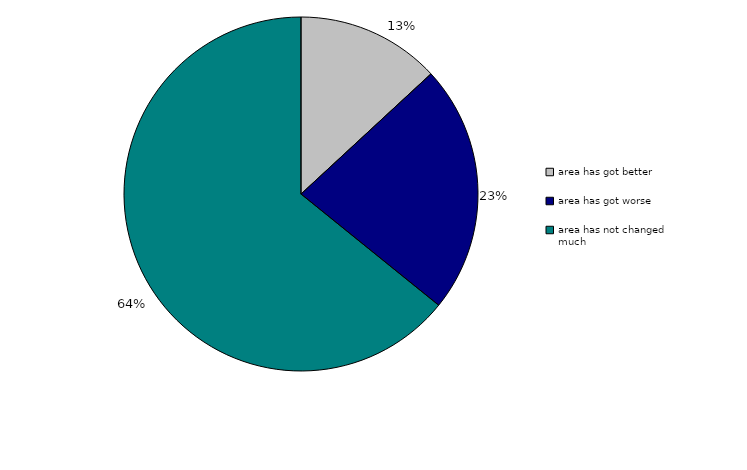
| Category | Series 0 |
|---|---|
| area has got better | 2416.151 |
| area has got worse | 4177.835 |
| area has not changed much | 11818.351 |